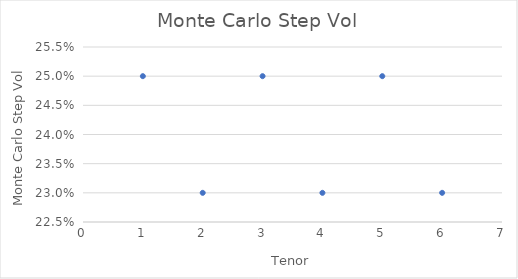
| Category | Monte Carlo Step Vol |
|---|---|
| 1.0 | 0.25 |
| 2.0 | 0.23 |
| 3.0 | 0.25 |
| 4.0 | 0.23 |
| 5.0 | 0.25 |
| 6.0 | 0.23 |